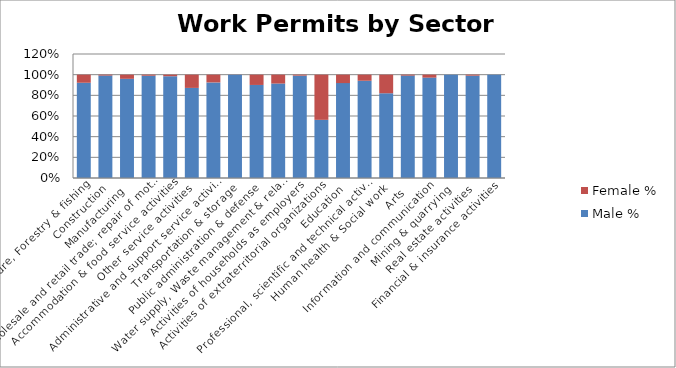
| Category | Male % | Female % |
|---|---|---|
| Agriculture, Forestry & fishing | 0.922 | 0.078 |
| Construction | 0.991 | 0.009 |
| Manufacturing | 0.96 | 0.04 |
| Wholesale and retail trade; repair of motor vehicles  | 0.99 | 0.01 |
| Accommodation & food service activities | 0.985 | 0.015 |
| Other service activities | 0.872 | 0.128 |
| Administrative and support service activities | 0.925 | 0.075 |
| Transportation & storage | 0.999 | 0.001 |
| Public administration & defense | 0.9 | 0.1 |
| Water supply, Waste management & related activities | 0.914 | 0.086 |
| Activities of households as employers | 0.991 | 0.009 |
| Activities of extraterritorial organizations  | 0.563 | 0.437 |
| Education | 0.918 | 0.082 |
| Professional, scientific and technical activities | 0.941 | 0.059 |
| Human health & Social work | 0.82 | 0.18 |
| Arts | 0.991 | 0.009 |
| Information and communication | 0.971 | 0.029 |
| Mining & quarrying | 1 | 0 |
| Real estate activities | 0.99 | 0.01 |
| Financial & insurance activities | 1 | 0 |